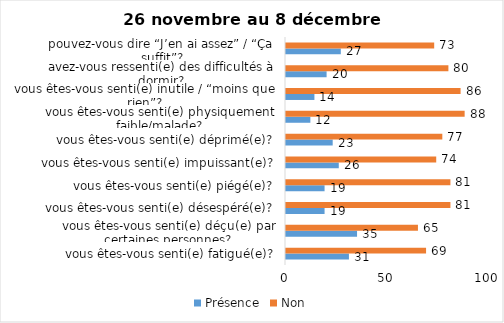
| Category | Présence | Non |
|---|---|---|
| vous êtes-vous senti(e) fatigué(e)? | 31 | 69 |
| vous êtes-vous senti(e) déçu(e) par certaines personnes? | 35 | 65 |
| vous êtes-vous senti(e) désespéré(e)? | 19 | 81 |
| vous êtes-vous senti(e) piégé(e)? | 19 | 81 |
| vous êtes-vous senti(e) impuissant(e)? | 26 | 74 |
| vous êtes-vous senti(e) déprimé(e)? | 23 | 77 |
| vous êtes-vous senti(e) physiquement faible/malade? | 12 | 88 |
| vous êtes-vous senti(e) inutile / “moins que rien”? | 14 | 86 |
| avez-vous ressenti(e) des difficultés à dormir? | 20 | 80 |
| pouvez-vous dire “J’en ai assez” / “Ça suffit”? | 27 | 73 |